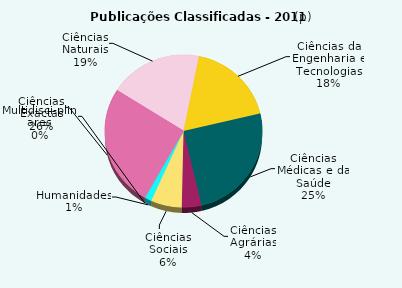
| Category | Series 0 |
|---|---|
| Ciências Exactas | 3539.567 |
| Ciências Naturais | 2649.783 |
| Ciências da Engenharia e Tecnologias | 2506 |
| Ciências Médicas e da Saúde | 3456.867 |
| Ciências Agrárias | 558 |
| Ciências Sociais | 879.617 |
| Humanidades | 188.167 |
| Multidisciplinares | 34 |